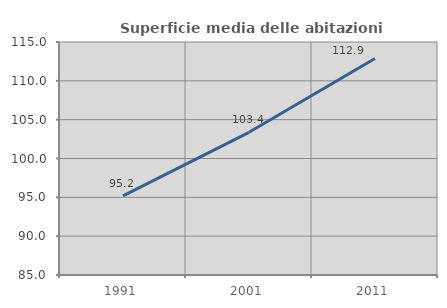
| Category | Superficie media delle abitazioni occupate |
|---|---|
| 1991.0 | 95.184 |
| 2001.0 | 103.37 |
| 2011.0 | 112.879 |